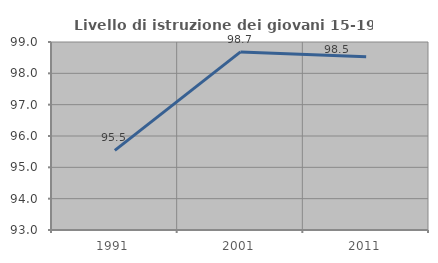
| Category | Livello di istruzione dei giovani 15-19 anni |
|---|---|
| 1991.0 | 95.543 |
| 2001.0 | 98.684 |
| 2011.0 | 98.529 |